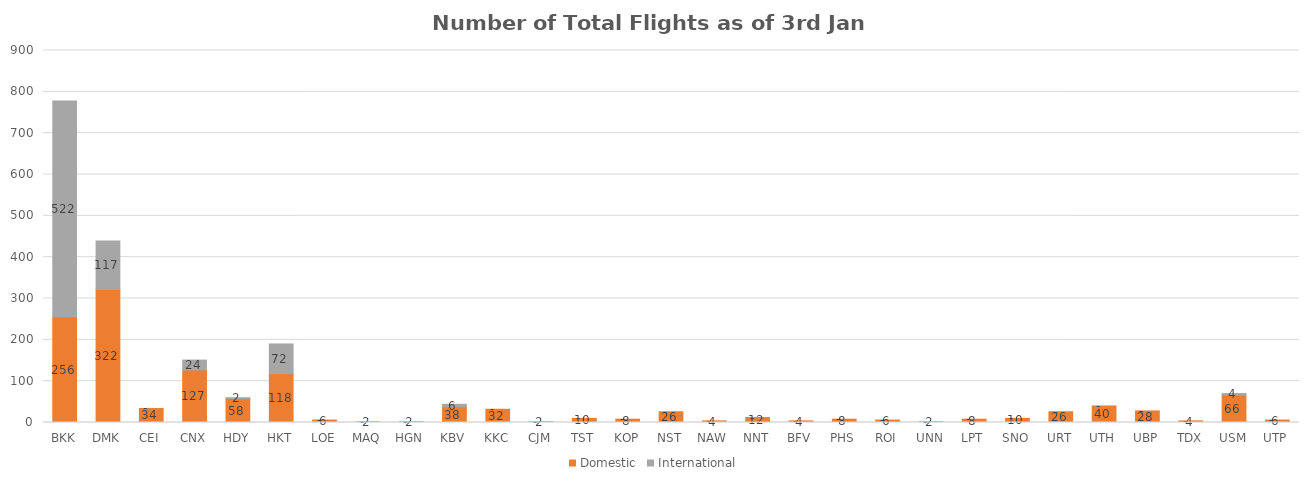
| Category | Domestic | International |
|---|---|---|
| BKK | 256 | 522 |
| DMK | 322 | 117 |
| CEI | 34 | 0 |
| CNX | 127 | 24 |
| HDY | 58 | 2 |
| HKT | 118 | 72 |
| LOE | 6 | 0 |
| MAQ | 2 | 0 |
| HGN | 2 | 0 |
| KBV | 38 | 6 |
| KKC | 32 | 0 |
| CJM | 2 | 0 |
| TST | 10 | 0 |
| KOP | 8 | 0 |
| NST | 26 | 0 |
| NAW | 4 | 0 |
| NNT | 12 | 0 |
| BFV | 4 | 0 |
| PHS | 8 | 0 |
| ROI | 6 | 0 |
| UNN | 2 | 0 |
| LPT | 8 | 0 |
| SNO | 10 | 0 |
| URT | 26 | 0 |
| UTH | 40 | 0 |
| UBP | 28 | 0 |
| TDX | 4 | 0 |
| USM | 66 | 4 |
| UTP | 6 | 0 |